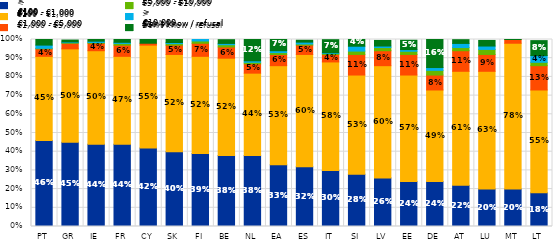
| Category | < €100 | €100 - €1,000 | €1,000 - €5,000 | €5,000 - €10,000 | > €10,000 | Don't know / refusal |
|---|---|---|---|---|---|---|
| PT | 0.46 | 0.45 | 0.04 | 0.003 | 0.017 | 0.03 |
| GR | 0.45 | 0.5 | 0.03 | 0.003 | 0.004 | 0.01 |
| IE | 0.44 | 0.5 | 0.04 | 0.004 | 0.007 | 0.01 |
| FR | 0.44 | 0.47 | 0.06 | 0.009 | 0.006 | 0.02 |
| CY | 0.42 | 0.55 | 0.01 | 0 | 0 | 0.03 |
| SK | 0.4 | 0.52 | 0.05 | 0.008 | 0.006 | 0.02 |
| FI | 0.39 | 0.52 | 0.07 | 0.012 | 0.01 | 0 |
| BE | 0.38 | 0.52 | 0.06 | 0.012 | 0.007 | 0.02 |
| NL | 0.38 | 0.44 | 0.05 | 0.008 | 0.008 | 0.12 |
| EA | 0.33 | 0.53 | 0.06 | 0.01 | 0.01 | 0.07 |
| ES | 0.32 | 0.6 | 0.05 | 0.006 | 0.01 | 0.01 |
| IT | 0.3 | 0.58 | 0.04 | 0.005 | 0.004 | 0.07 |
| SI | 0.28 | 0.53 | 0.11 | 0.018 | 0.026 | 0.04 |
| LV | 0.26 | 0.6 | 0.08 | 0.017 | 0.008 | 0.03 |
| EE | 0.24 | 0.57 | 0.11 | 0.017 | 0.009 | 0.05 |
| DE | 0.24 | 0.49 | 0.08 | 0.025 | 0.015 | 0.16 |
| AT | 0.22 | 0.61 | 0.11 | 0.017 | 0.022 | 0.02 |
| LU | 0.2 | 0.63 | 0.09 | 0.027 | 0.018 | 0.03 |
| MT | 0.2 | 0.78 | 0.02 | 0 | 0 | 0.01 |
| LT | 0.18 | 0.55 | 0.13 | 0.018 | 0.036 | 0.08 |